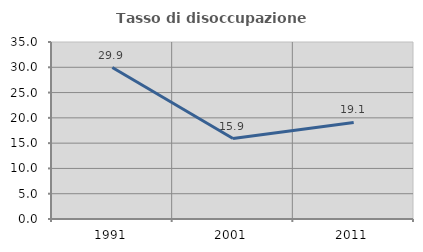
| Category | Tasso di disoccupazione giovanile  |
|---|---|
| 1991.0 | 29.949 |
| 2001.0 | 15.909 |
| 2011.0 | 19.087 |